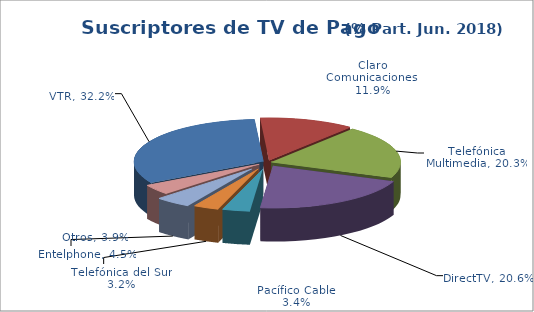
| Category | Series 0 |
|---|---|
| VTR | 0.322 |
| Claro Comunicaciones | 0.119 |
| Telefónica Multimedia | 0.203 |
| DirectTV | 0.206 |
| Pacífico Cable | 0.034 |
| Telefónica del Sur | 0.032 |
| Entelphone | 0.045 |
| Otros | 0.039 |